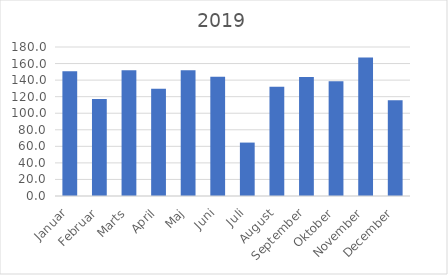
| Category | 2019 |
|---|---|
| Januar | 150.563 |
| Februar | 117.161 |
| Marts | 151.878 |
| April | 129.659 |
| Maj | 151.878 |
| Juni | 144.204 |
| Juli | 64.537 |
| August | 131.925 |
| September | 143.692 |
| Oktober | 138.649 |
| November | 167.227 |
| December | 115.626 |